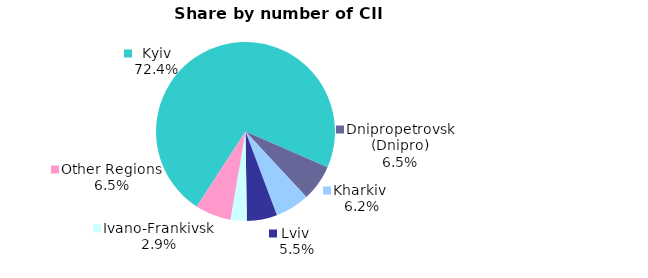
| Category | Series 0 |
|---|---|
| Kyiv | 0.724 |
| Dnipropetrovsk (Dnipro) | 0.065 |
| Kharkiv  | 0.062 |
| Lviv  | 0.055 |
| Ivano-Frankivsk | 0.029 |
| Other Regions | 0.065 |